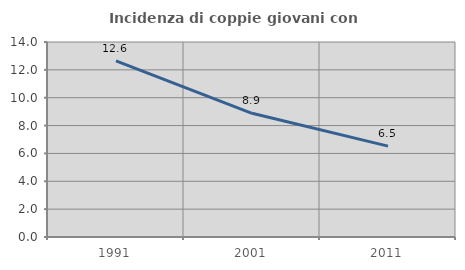
| Category | Incidenza di coppie giovani con figli |
|---|---|
| 1991.0 | 12.648 |
| 2001.0 | 8.881 |
| 2011.0 | 6.526 |